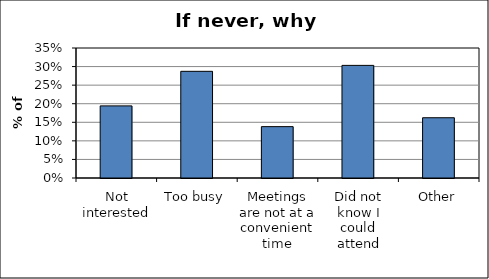
| Category | Series 0 |
|---|---|
| Not interested | 0.194 |
| Too busy | 0.287 |
| Meetings are not at a convenient time | 0.138 |
| Did not know I could attend | 0.303 |
| Other | 0.162 |